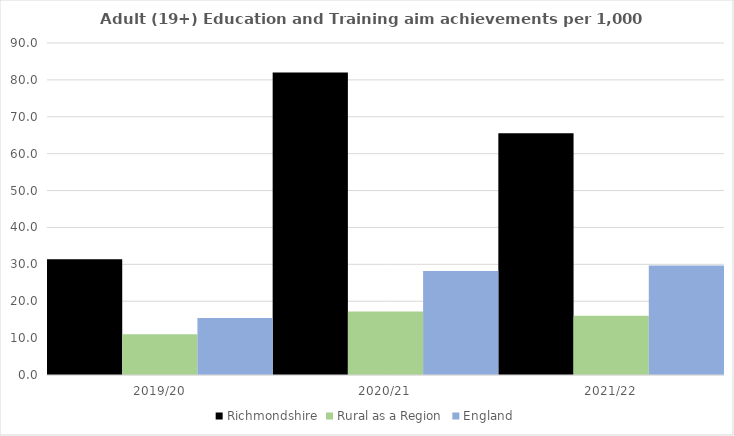
| Category | Richmondshire | Rural as a Region | England |
|---|---|---|---|
| 2019/20 | 31.386 | 11.081 | 15.446 |
| 2020/21 | 82.009 | 17.224 | 28.211 |
| 2021/22 | 65.527 | 16.063 | 29.711 |